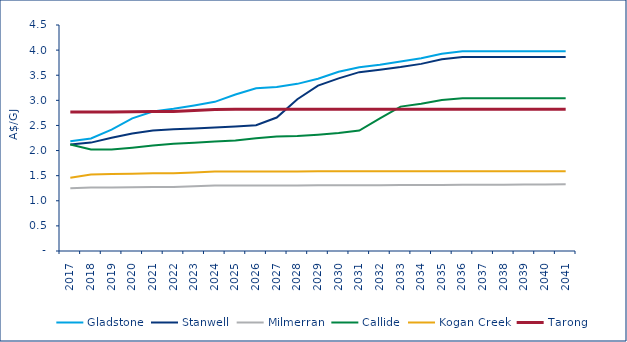
| Category | Gladstone | Stanwell | Milmerran | Callide | Kogan Creek | Tarong |
|---|---|---|---|---|---|---|
| 2017.0 | 2.184 | 2.121 | 1.249 | 2.12 | 1.459 | 2.766 |
| 2018.0 | 2.24 | 2.158 | 1.265 | 2.02 | 1.521 | 2.766 |
| 2019.0 | 2.415 | 2.254 | 1.265 | 2.02 | 1.535 | 2.766 |
| 2020.0 | 2.641 | 2.341 | 1.269 | 2.057 | 1.54 | 2.772 |
| 2021.0 | 2.777 | 2.399 | 1.274 | 2.103 | 1.546 | 2.778 |
| 2022.0 | 2.833 | 2.422 | 1.275 | 2.135 | 1.547 | 2.779 |
| 2023.0 | 2.899 | 2.441 | 1.289 | 2.157 | 1.564 | 2.799 |
| 2024.0 | 2.97 | 2.46 | 1.303 | 2.181 | 1.581 | 2.819 |
| 2025.0 | 3.117 | 2.48 | 1.304 | 2.2 | 1.582 | 2.82 |
| 2026.0 | 3.239 | 2.505 | 1.305 | 2.243 | 1.583 | 2.821 |
| 2027.0 | 3.265 | 2.657 | 1.305 | 2.279 | 1.584 | 2.822 |
| 2028.0 | 3.328 | 3.023 | 1.306 | 2.289 | 1.585 | 2.824 |
| 2029.0 | 3.429 | 3.293 | 1.308 | 2.315 | 1.586 | 2.824 |
| 2030.0 | 3.569 | 3.438 | 1.309 | 2.35 | 1.586 | 2.824 |
| 2031.0 | 3.658 | 3.561 | 1.31 | 2.398 | 1.586 | 2.824 |
| 2032.0 | 3.709 | 3.611 | 1.311 | 2.642 | 1.586 | 2.824 |
| 2033.0 | 3.772 | 3.662 | 1.313 | 2.875 | 1.586 | 2.824 |
| 2034.0 | 3.837 | 3.726 | 1.314 | 2.934 | 1.586 | 2.824 |
| 2035.0 | 3.929 | 3.816 | 1.316 | 3.005 | 1.586 | 2.824 |
| 2036.0 | 3.976 | 3.861 | 1.317 | 3.04 | 1.586 | 2.824 |
| 2037.0 | 3.976 | 3.861 | 1.319 | 3.04 | 1.586 | 2.824 |
| 2038.0 | 3.976 | 3.861 | 1.321 | 3.04 | 1.586 | 2.824 |
| 2039.0 | 3.976 | 3.861 | 1.323 | 3.04 | 1.586 | 2.824 |
| 2040.0 | 3.976 | 3.861 | 1.326 | 3.04 | 1.586 | 2.824 |
| 2041.0 | 3.976 | 3.861 | 1.328 | 3.04 | 1.586 | 2.824 |